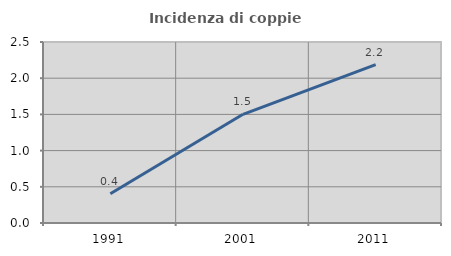
| Category | Incidenza di coppie miste |
|---|---|
| 1991.0 | 0.404 |
| 2001.0 | 1.501 |
| 2011.0 | 2.189 |